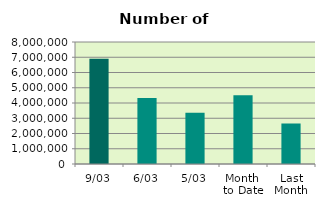
| Category | Series 0 |
|---|---|
| 9/03 | 6908644 |
| 6/03 | 4323220 |
| 5/03 | 3355708 |
| Month 
to Date | 4509505.333 |
| Last
Month | 2656039 |